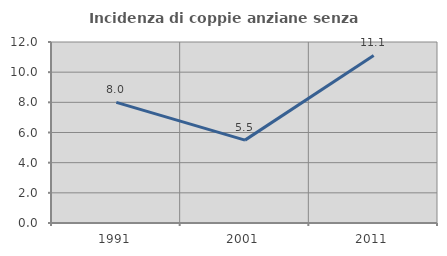
| Category | Incidenza di coppie anziane senza figli  |
|---|---|
| 1991.0 | 8 |
| 2001.0 | 5.495 |
| 2011.0 | 11.111 |